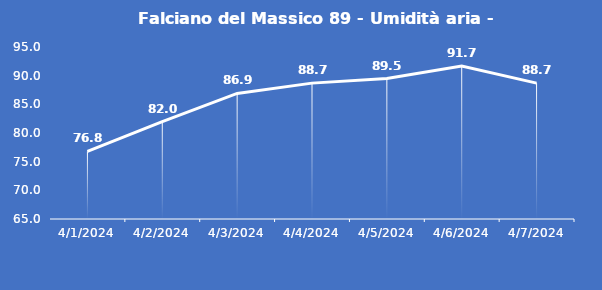
| Category | Falciano del Massico 89 - Umidità aria - Grezzo (%) |
|---|---|
| 4/1/24 | 76.8 |
| 4/2/24 | 82 |
| 4/3/24 | 86.9 |
| 4/4/24 | 88.7 |
| 4/5/24 | 89.5 |
| 4/6/24 | 91.7 |
| 4/7/24 | 88.7 |